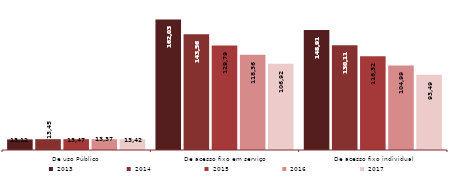
| Category | 2013 | 2014 | 2015 | 2016 | 2017 |
|---|---|---|---|---|---|
| De uso Público  | 13124 | 13450 | 13470 | 13370 | 13426 |
| De acesso fixo em serviço | 162036 | 143562 | 129793 | 118367 | 106923 |
| De acesso fixo individual | 148912 | 130112 | 116323 | 104997 | 93497 |